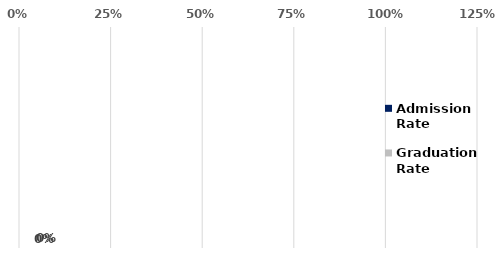
| Category | Admission
Rate | Graduation
Rate |
|---|---|---|
| White or Caucasian | 0 | 0 |
| Black or African-American | 0 | 0 |
| American Indian or Alaska Native | 0 | 0 |
| Asian | 0 | 0 |
| Pacific Islander | 0 | 0 |
| Blended Race | 0 | 0 |
| Other | 0 | 0 |
| Total | 0 | 0 |